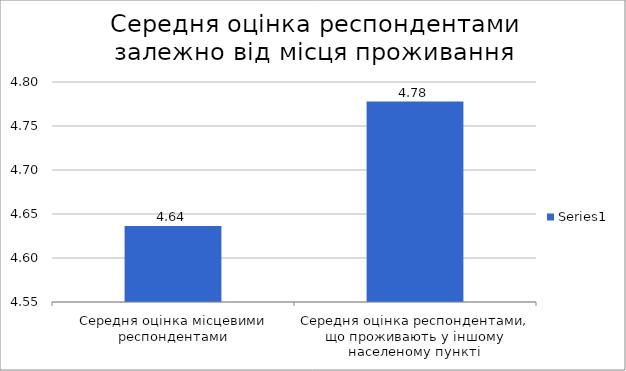
| Category | Series 0 |
|---|---|
| Середня оцінка місцевими респондентами | 4.636 |
| Середня оцінка респондентами, що проживають у іншому населеному пункті | 4.778 |